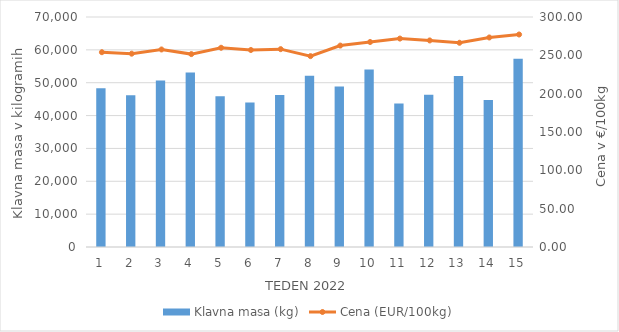
| Category | Klavna masa (kg) |
|---|---|
| 1.0 | 48349 |
| 2.0 | 46187 |
| 3.0 | 50692 |
| 4.0 | 53081 |
| 5.0 | 45844 |
| 6.0 | 43982 |
| 7.0 | 46227 |
| 8.0 | 52099 |
| 9.0 | 48872 |
| 10.0 | 54045 |
| 11.0 | 43645 |
| 12.0 | 46350 |
| 13.0 | 52061 |
| 14.0 | 44774 |
| 15.0 | 57268 |